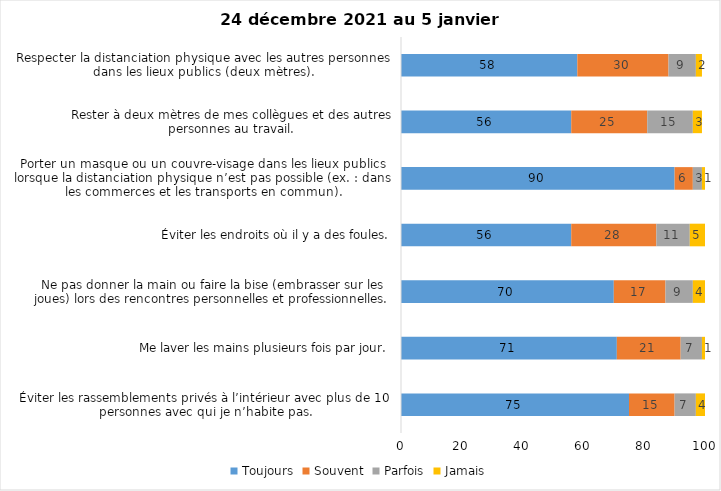
| Category | Toujours | Souvent | Parfois | Jamais |
|---|---|---|---|---|
| Éviter les rassemblements privés à l’intérieur avec plus de 10 personnes avec qui je n’habite pas. | 75 | 15 | 7 | 4 |
| Me laver les mains plusieurs fois par jour. | 71 | 21 | 7 | 1 |
| Ne pas donner la main ou faire la bise (embrasser sur les joues) lors des rencontres personnelles et professionnelles. | 70 | 17 | 9 | 4 |
| Éviter les endroits où il y a des foules. | 56 | 28 | 11 | 5 |
| Porter un masque ou un couvre-visage dans les lieux publics lorsque la distanciation physique n’est pas possible (ex. : dans les commerces et les transports en commun). | 90 | 6 | 3 | 1 |
| Rester à deux mètres de mes collègues et des autres personnes au travail. | 56 | 25 | 15 | 3 |
| Respecter la distanciation physique avec les autres personnes dans les lieux publics (deux mètres). | 58 | 30 | 9 | 2 |